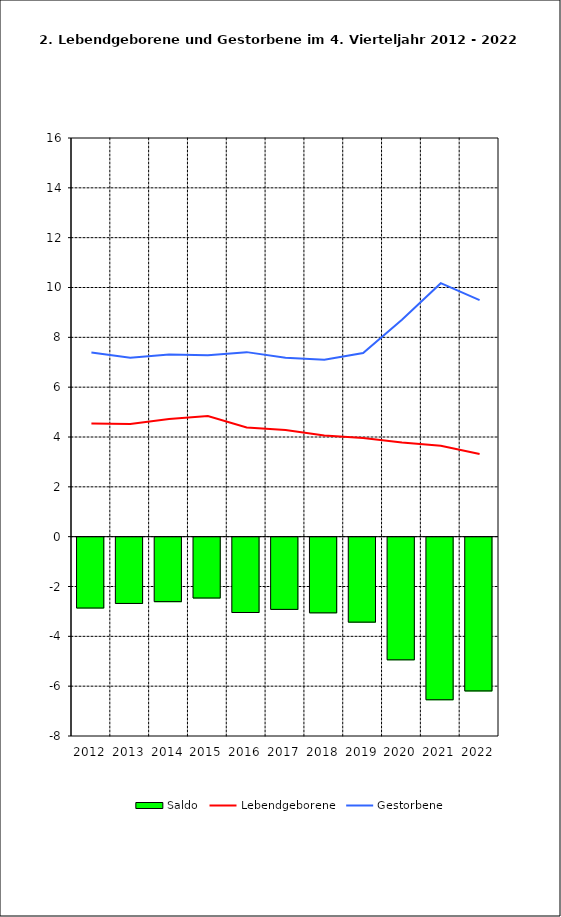
| Category | Saldo |
|---|---|
| 2011.0 | -2.844 |
| 2012.0 | -2.66 |
| 2013.0 | -2.587 |
| 2014.0 | -2.442 |
| 2015.0 | -3.024 |
| 2016.0 | -2.898 |
| 2017.0 | -3.038 |
| 2018.0 | -3.41 |
| 2019.0 | -4.924 |
| 2020.0 | -6.526 |
| 2021.0 | -6.171 |